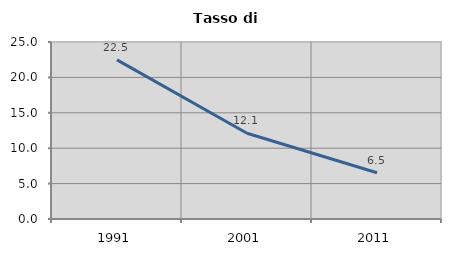
| Category | Tasso di disoccupazione   |
|---|---|
| 1991.0 | 22.478 |
| 2001.0 | 12.111 |
| 2011.0 | 6.53 |